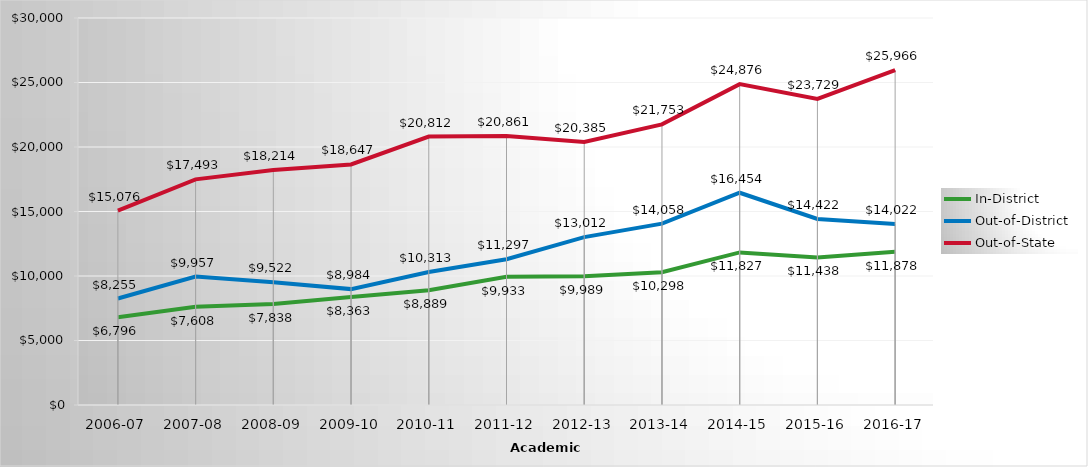
| Category | In-District | Out-of-District | Out-of-State |
|---|---|---|---|
| 2006-07 | 6796 | 8255 | 15076 |
| 2007-08 | 7608 | 9957 | 17493 |
| 2008-09 | 7838.053 | 9522.053 | 18213.684 |
| 2009-10 | 8363 | 8984 | 18647 |
| 2010-11 | 8889 | 10313 | 20812 |
| 2011-12 | 9933.23 | 11297.18 | 20861.23 |
| 2012-13 | 9988.67 | 13011.78 | 20384.67 |
| 2013-14 | 10297.84 | 14057.56 | 21753.28 |
| 2014-15 | 11827.062 | 16453.562 | 24875.688 |
| 2015-16 | 11438 | 14422 | 23729 |
| 2016-17 | 11878 | 14022 | 25966 |